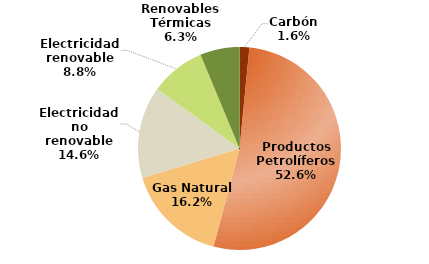
| Category | Series 0 |
|---|---|
| Carbón | 1340.126 |
| Productos Petrolíferos | 45144.069 |
| Gas Natural | 13890.975 |
| Electricidad no renovable | 12581.385 |
| Electricidad renovable | 7533.463 |
| Renovables Térmicas | 5385.011 |